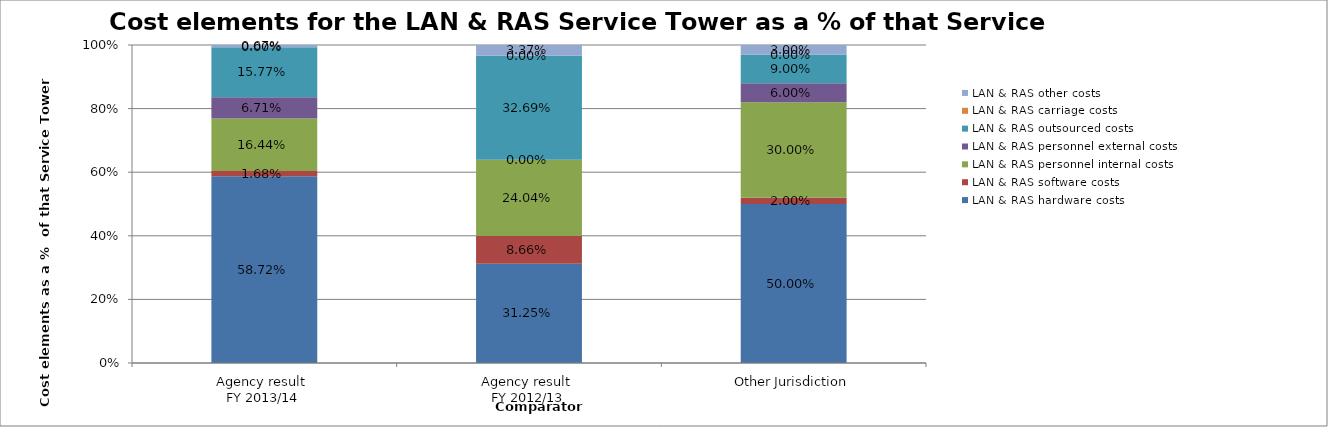
| Category | LAN & RAS hardware costs | LAN & RAS software costs | LAN & RAS personnel internal costs | LAN & RAS personnel external costs | LAN & RAS outsourced costs | LAN & RAS carriage costs | LAN & RAS other costs |
|---|---|---|---|---|---|---|---|
| Agency result 
FY 2013/14 | 0.587 | 0.017 | 0.164 | 0.067 | 0.158 | 0 | 0.007 |
| Agency result 
FY 2012/13 | 0.312 | 0.087 | 0.24 | 0 | 0.327 | 0 | 0.034 |
| Other Jurisdiction | 0.5 | 0.02 | 0.3 | 0.06 | 0.09 | 0 | 0.03 |